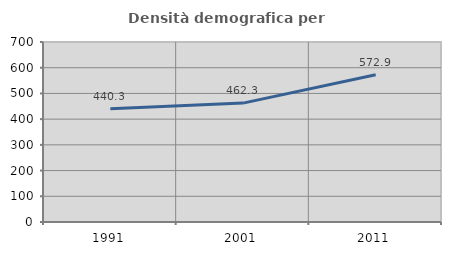
| Category | Densità demografica |
|---|---|
| 1991.0 | 440.325 |
| 2001.0 | 462.317 |
| 2011.0 | 572.885 |